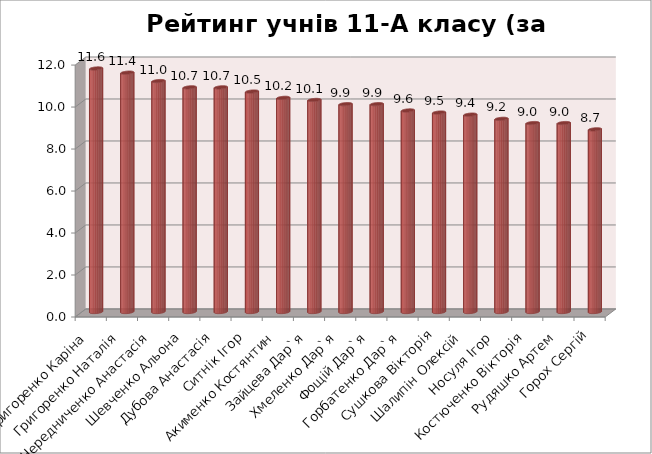
| Category | Series 0 |
|---|---|
| Григоренко Каріна | 11.6 |
| Григоренко Наталія | 11.4 |
| Чередниченко Анастасія | 11 |
| Шевченко Альона | 10.7 |
| Дубова Анастасія | 10.7 |
| Ситнік Ігор | 10.5 |
| Акименко Костянтин | 10.2 |
| Зайцева Дар`я | 10.1 |
| Хмеленко Дар`я | 9.9 |
| Фощій Дар`я | 9.9 |
|  Горбатенко Дар`я | 9.6 |
| Сушкова Вікторія | 9.5 |
| Шалипін Олексій | 9.4 |
|  Носуля Ігор | 9.2 |
| Костюченко Вікторія | 9 |
| Рудяшко Артем | 9 |
| Горох Сергій | 8.7 |